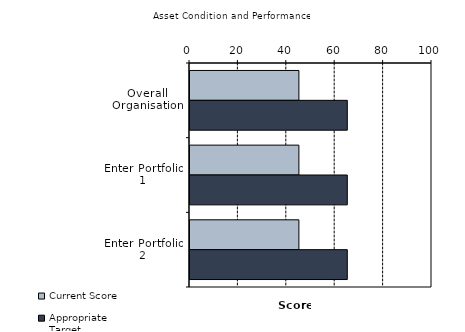
| Category | Current Score | Appropriate Target |
|---|---|---|
| Overall Organisation | 45 | 65 |
| Enter Portfolio 1 | 45 | 65 |
| Enter Portfolio 2 | 45 | 65 |